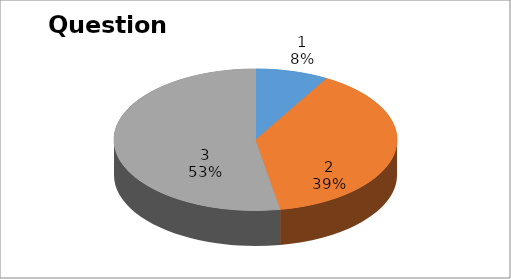
| Category | Series 0 |
|---|---|
| 0 | 3 |
| 1 | 14 |
| 2 | 19 |